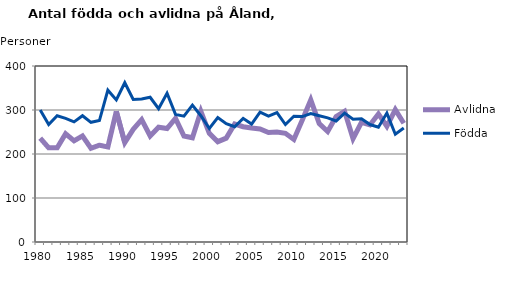
| Category | Avlidna | Födda |
|---|---|---|
| 1980.0 | 236 | 300 |
| 1981.0 | 214 | 267 |
| 1982.0 | 214 | 287 |
| 1983.0 | 246 | 281 |
| 1984.0 | 230 | 273 |
| 1985.0 | 241 | 287 |
| 1986.0 | 213 | 272 |
| 1987.0 | 220 | 276 |
| 1988.0 | 216 | 345 |
| 1989.0 | 297 | 323 |
| 1990.0 | 226 | 362 |
| 1991.0 | 256 | 324 |
| 1992.0 | 278 | 325 |
| 1993.0 | 241 | 329 |
| 1994.0 | 261 | 303 |
| 1995.0 | 258 | 338 |
| 1996.0 | 281 | 290 |
| 1997.0 | 241 | 286 |
| 1998.0 | 237 | 311 |
| 1999.0 | 297 | 287 |
| 2000.0 | 247 | 258 |
| 2001.0 | 228 | 283 |
| 2002.0 | 236 | 269 |
| 2003.0 | 268 | 262 |
| 2004.0 | 262 | 281 |
| 2005.0 | 259 | 268 |
| 2006.0 | 257 | 295 |
| 2007.0 | 249 | 286 |
| 2008.0 | 250 | 294 |
| 2009.0 | 247 | 267 |
| 2010.0 | 233 | 286 |
| 2011.0 | 277 | 285 |
| 2012.0 | 323 | 292 |
| 2013.0 | 269 | 287 |
| 2014.0 | 251 | 282 |
| 2015.0 | 285 | 275 |
| 2016.0 | 297 | 293 |
| 2017.0 | 235 | 279 |
| 2018.0 | 272 | 280 |
| 2019.0 | 266 | 267 |
| 2020.0 | 291 | 261 |
| 2021.0 | 263 | 293 |
| 2022.0 | 301 | 245 |
| 2023.0 | 270 | 259 |